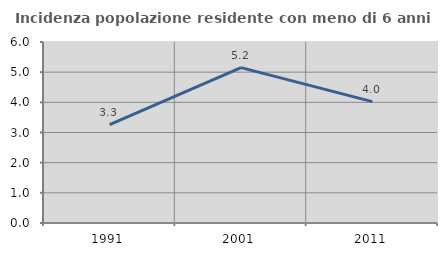
| Category | Incidenza popolazione residente con meno di 6 anni |
|---|---|
| 1991.0 | 3.262 |
| 2001.0 | 5.152 |
| 2011.0 | 4.022 |